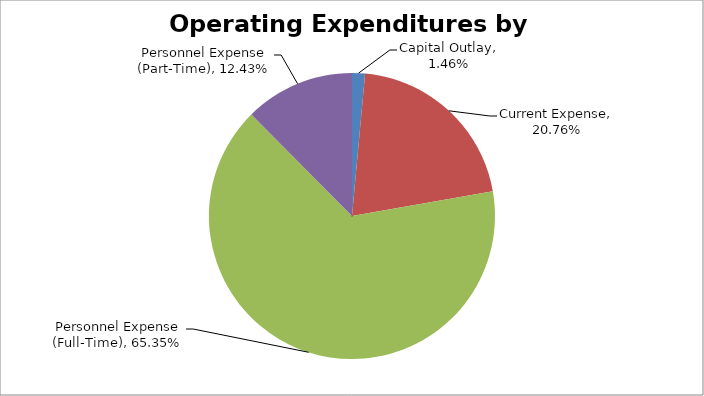
| Category | Series 0 |
|---|---|
| Capital Outlay | 0.015 |
| Current Expense | 0.208 |
| Personnel Expense (Full-Time) | 0.653 |
| Personnel Expense (Part-Time) | 0.124 |